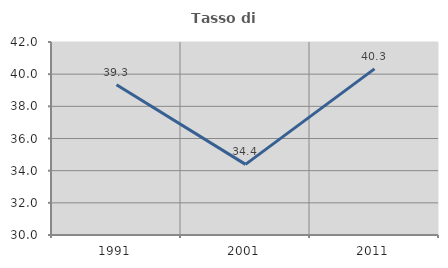
| Category | Tasso di occupazione   |
|---|---|
| 1991.0 | 39.34 |
| 2001.0 | 34.391 |
| 2011.0 | 40.327 |